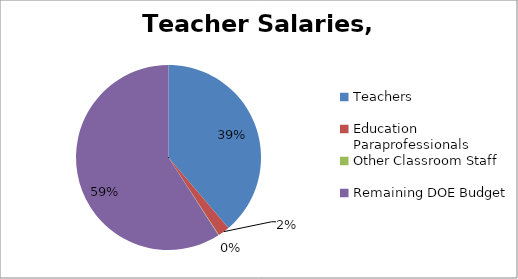
| Category | Series 0 |
|---|---|
| Teachers  | 6862 |
| Education Paraprofessionals  | 362 |
| Other Classroom Staff  | 16 |
| Remaining DOE Budget | 10455 |